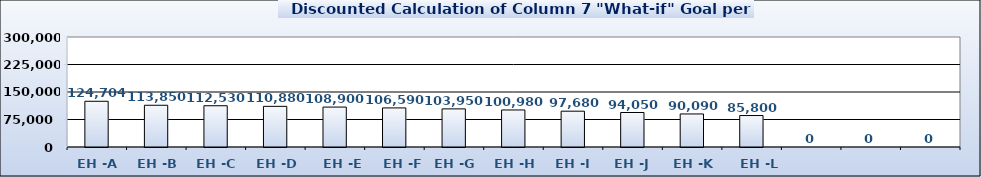
| Category | Series 0 |
|---|---|
| EH -A | 124704 |
| EH -B | 113850 |
| EH -C | 112530 |
| EH -D | 110880 |
| EH -E | 108900 |
| EH -F | 106590 |
| EH -G | 103950 |
| EH -H | 100980 |
| EH -I | 97680 |
| EH -J | 94050 |
| EH -K | 90090 |
| EH -L | 85800 |
|   | 0 |
|   | 0 |
|   | 0 |